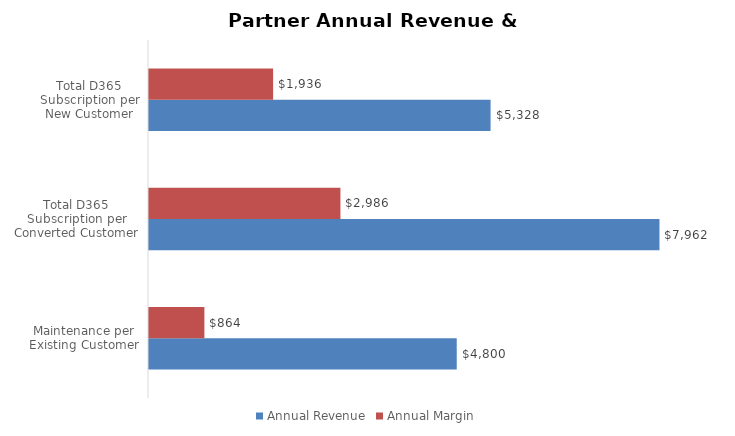
| Category | Annual Revenue | Annual Margin |
|---|---|---|
| Maintenance per Existing Customer | 4800 | 864 |
| Total D365 Subscription per Converted Customer | 7962.24 | 2985.84 |
| Total D365 Subscription per New Customer | 5328 | 1935.84 |